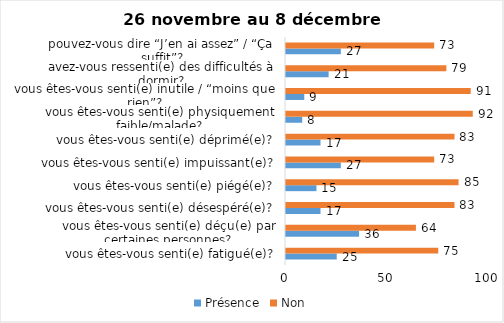
| Category | Présence | Non |
|---|---|---|
| vous êtes-vous senti(e) fatigué(e)? | 25 | 75 |
| vous êtes-vous senti(e) déçu(e) par certaines personnes? | 36 | 64 |
| vous êtes-vous senti(e) désespéré(e)? | 17 | 83 |
| vous êtes-vous senti(e) piégé(e)? | 15 | 85 |
| vous êtes-vous senti(e) impuissant(e)? | 27 | 73 |
| vous êtes-vous senti(e) déprimé(e)? | 17 | 83 |
| vous êtes-vous senti(e) physiquement faible/malade? | 8 | 92 |
| vous êtes-vous senti(e) inutile / “moins que rien”? | 9 | 91 |
| avez-vous ressenti(e) des difficultés à dormir? | 21 | 79 |
| pouvez-vous dire “J’en ai assez” / “Ça suffit”? | 27 | 73 |